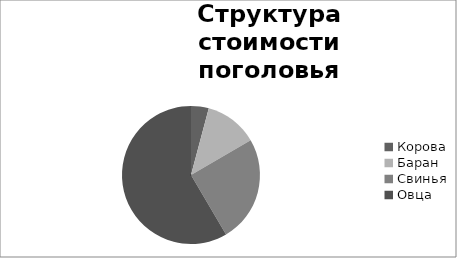
| Category | На начало квартала |
|---|---|
| Корова | 200 |
| Баран | 600 |
| Свинья | 1200 |
| Овца | 2816 |